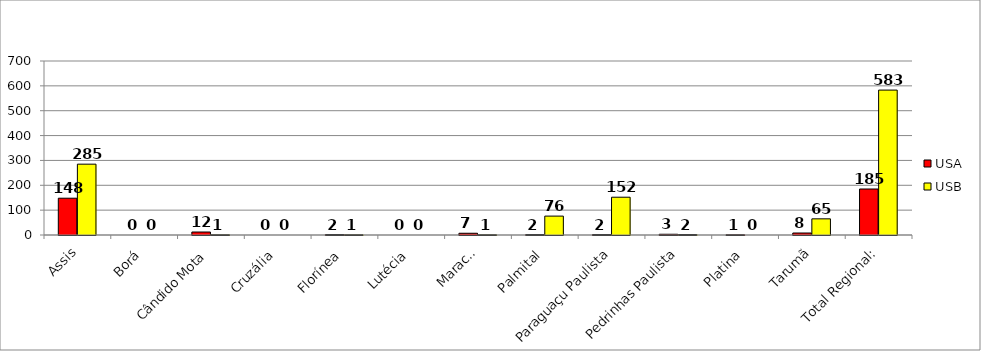
| Category | USA | USB |
|---|---|---|
| Assis | 148 | 285 |
| Borá | 0 | 0 |
| Cândido Mota | 12 | 1 |
| Cruzália | 0 | 0 |
| Florínea | 2 | 1 |
| Lutécia | 0 | 0 |
| Maracaí | 7 | 1 |
| Palmital | 2 | 76 |
| Paraguaçu Paulista | 2 | 152 |
| Pedrinhas Paulista | 3 | 2 |
| Platina | 1 | 0 |
| Tarumã | 8 | 65 |
| Total Regional: | 185 | 583 |